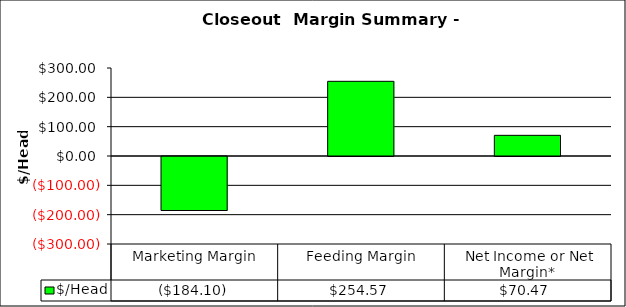
| Category | $/Head  |
|---|---|
| Marketing Margin | -184.102 |
| Feeding Margin | 254.568 |
| Net Income or Net Margin*  | 70.467 |